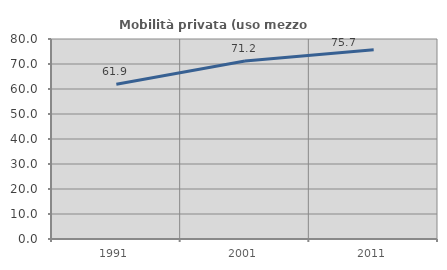
| Category | Mobilità privata (uso mezzo privato) |
|---|---|
| 1991.0 | 61.871 |
| 2001.0 | 71.213 |
| 2011.0 | 75.73 |